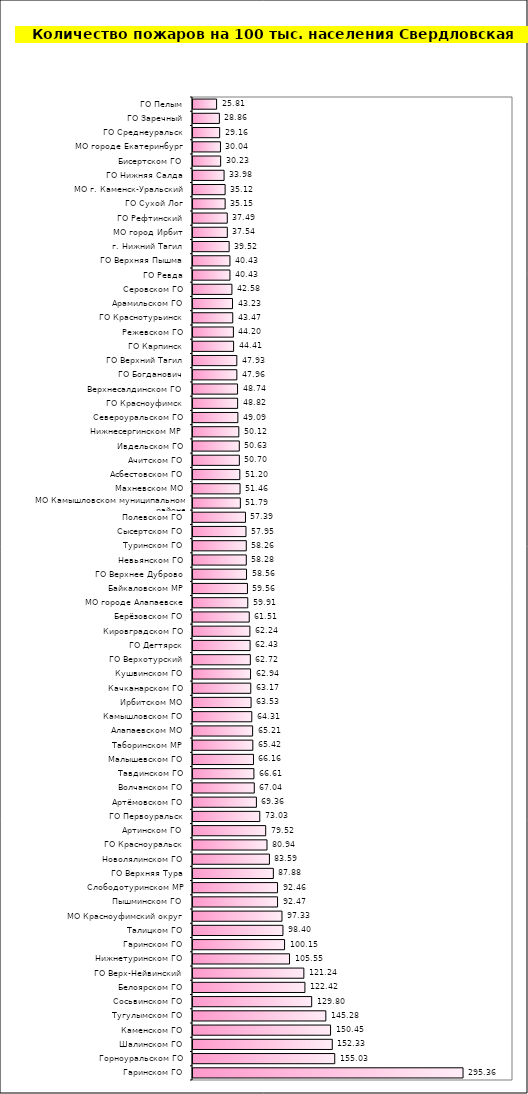
| Category | Series 0 |
|---|---|
| Гаринском ГО | 295.359 |
| Горноуральском ГО | 155.029 |
| Шалинском ГО | 152.331 |
| Каменском ГО | 150.446 |
| Тугулымском ГО | 145.283 |
| Сосьвинском ГО | 129.805 |
| Белоярском ГО | 122.423 |
| ГО Верх-Нейвинский | 121.237 |
| Нижнетуринском ГО | 105.547 |
| Гаринском ГО | 100.15 |
| Талицком ГО | 98.403 |
| МО Красноуфимский округ | 97.325 |
| Пышминском ГО | 92.469 |
| Слободотуринском МР | 92.457 |
| ГО Верхняя Тура | 87.883 |
| Новолялинском ГО | 83.589 |
| ГО Красноуральск | 80.937 |
| Артинском ГО | 79.517 |
| ГО Первоуральск | 73.026 |
| Артёмовском ГО | 69.358 |
| Волчанском ГО | 67.039 |
| Тавдинском ГО | 66.609 |
| Малышевском ГО | 66.156 |
| Таборинском МР | 65.424 |
| Алапаевском МО | 65.208 |
| Камышловском ГО | 64.311 |
| Ирбитском МО | 63.53 |
| Качканарском ГО | 63.165 |
| Кушвинском ГО | 62.939 |
| ГО Верхотурский | 62.72 |
| ГО Дегтярск | 62.43 |
| Кировградском ГО | 62.24 |
| Берёзовском ГО | 61.51 |
| МО городе Алапаевске | 59.912 |
| Байкаловском МР | 59.563 |
| ГО Верхнее Дуброво | 58.559 |
| Невьянском ГО | 58.284 |
| Туринском ГО | 58.264 |
| Сысертском ГО | 57.953 |
| Полевском ГО | 57.395 |
| МО Камышловском муниципальном районе | 51.792 |
| Махневском МО | 51.458 |
| Асбестовском ГО | 51.204 |
| Ачитском ГО | 50.697 |
| Ивдельском ГО | 50.626 |
| Нижнесергинском МР | 50.119 |
| Североуральском ГО | 49.092 |
| ГО Красноуфимск | 48.824 |
| Верхнесалдинском ГО | 48.737 |
| ГО Богданович | 47.956 |
| ГО Верхний Тагил | 47.931 |
| ГО Карпинск | 44.411 |
| Режевском ГО | 44.198 |
| ГО Краснотурьинск | 43.466 |
| Арамильском ГО | 43.229 |
| Серовском ГО | 42.581 |
| ГО Ревда | 40.432 |
| ГО Верхняя Пышма | 40.426 |
| г. Нижний Тагил | 39.517 |
| МО город Ирбит | 37.538 |
| ГО Рефтинский | 37.488 |
| ГО Сухой Лог | 35.151 |
| МО г. Каменск-Уральский | 35.122 |
| ГО Нижняя Салда | 33.975 |
| Бисертском ГО | 30.233 |
| МО городе Екатеринбург | 30.036 |
| ГО Среднеуральск | 29.159 |
| ГО Заречный | 28.857 |
| ГО Пелым | 25.813 |